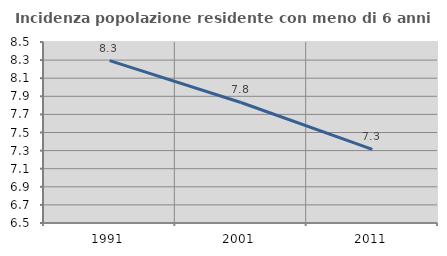
| Category | Incidenza popolazione residente con meno di 6 anni |
|---|---|
| 1991.0 | 8.294 |
| 2001.0 | 7.832 |
| 2011.0 | 7.313 |